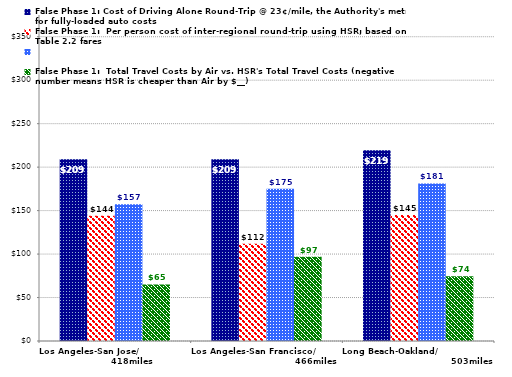
| Category | False Phase 1: Cost of Driving Alone Round-Trip @ 23¢/mile, the Authority's metric for fully-loaded auto costs | False Phase 1:  Per person cost of inter-regional round-trip using HSR; based on Table 2.2 fares | Series 2 | False Phase 1:  Total Travel Costs by Air vs. HSR's Total Travel Costs (negative number means HSR is cheaper than Air by $__) |
|---|---|---|---|---|
| Los Angeles-San Jose/                              418miles | 209 | 144 | 157.32 | 65 |
| Los Angeles-San Francisco/                                          466miles | 209 | 112 | 175.26 | 97 |
| Long Beach-Oakland/                                                      503miles | 219.4 | 145 | 181.24 | 74.4 |